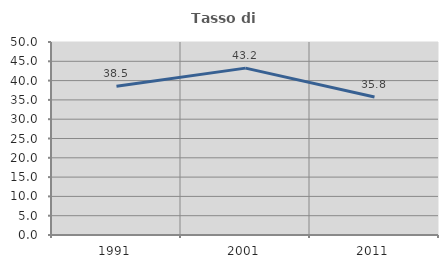
| Category | Tasso di occupazione   |
|---|---|
| 1991.0 | 38.549 |
| 2001.0 | 43.234 |
| 2011.0 | 35.763 |